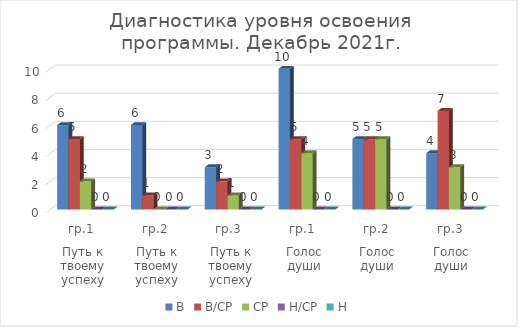
| Category | В | В/СР | СР | Н/СР | Н |
|---|---|---|---|---|---|
| 0 | 6 | 5 | 2 | 0 | 0 |
| 1 | 6 | 1 | 0 | 0 | 0 |
| 2 | 3 | 2 | 1 | 0 | 0 |
| 3 | 10 | 5 | 4 | 0 | 0 |
| 4 | 5 | 5 | 5 | 0 | 0 |
| 5 | 4 | 7 | 3 | 0 | 0 |